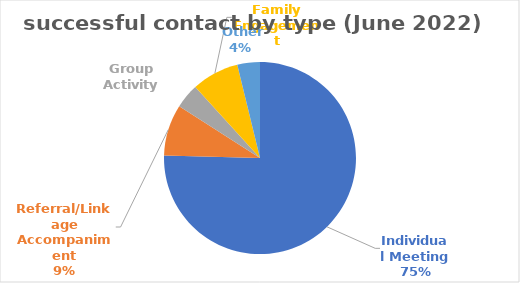
| Category | Series 0 |
|---|---|
| Individual Meeting | 218 |
| Referral/Linkage Accompaniment | 25 |
| Group Activity | 12 |
| Family Engagement | 23 |
|  Other | 11 |